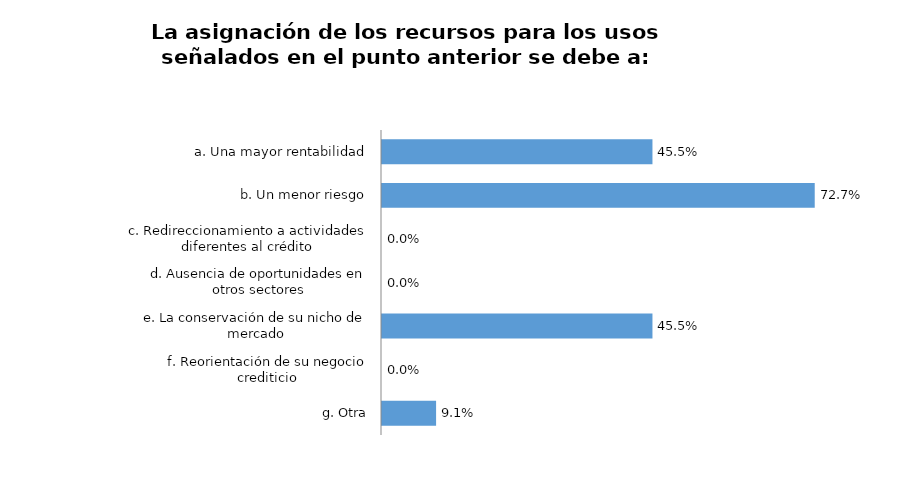
| Category | Series 0 |
|---|---|
| a. Una mayor rentabilidad | 0.455 |
| b. Un menor riesgo | 0.727 |
| c. Redireccionamiento a actividades diferentes al crédito | 0 |
| d. Ausencia de oportunidades en otros sectores | 0 |
| e. La conservación de su nicho de mercado | 0.455 |
| f. Reorientación de su negocio crediticio | 0 |
| g. Otra | 0.091 |